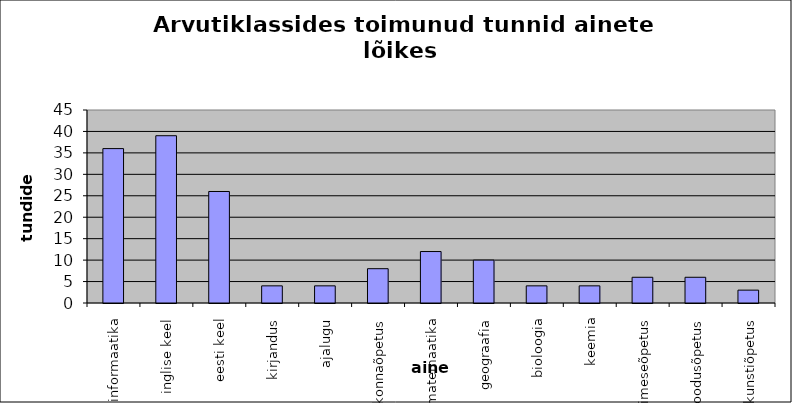
| Category | Series 0 |
|---|---|
| informaatika | 36 |
| inglise keel | 39 |
| eesti keel | 26 |
| kirjandus | 4 |
| ajalugu | 4 |
| ühiskonnaõpetus | 8 |
| matemaatika | 12 |
| geograafia | 10 |
| bioloogia | 4 |
| keemia | 4 |
| Inimeseõpetus | 6 |
| loodusõpetus | 6 |
| kunstiõpetus | 3 |